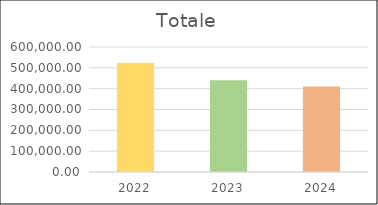
| Category | Series 0 |
|---|---|
| 2022.0 | 523800 |
| 2023.0 | 440000 |
| 2024.0 | 410000 |